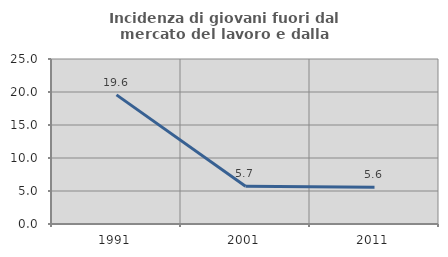
| Category | Incidenza di giovani fuori dal mercato del lavoro e dalla formazione  |
|---|---|
| 1991.0 | 19.565 |
| 2001.0 | 5.714 |
| 2011.0 | 5.556 |